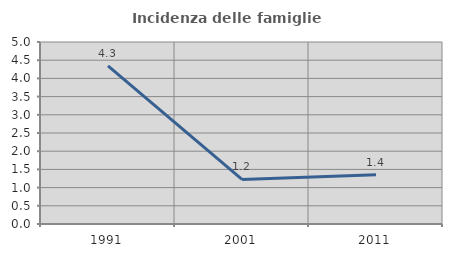
| Category | Incidenza delle famiglie numerose |
|---|---|
| 1991.0 | 4.344 |
| 2001.0 | 1.224 |
| 2011.0 | 1.355 |